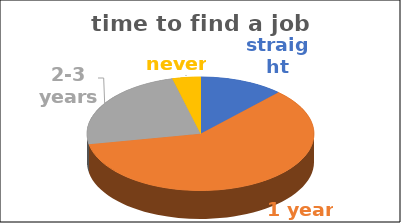
| Category | time to find a job | Series 1 | Series 2 | Series 3 | Series 4 |
|---|---|---|---|---|---|
| straight away | 0.12 |  |  |  |  |
| 1 year | 0.6 |  |  |  |  |
| 2-3 years | 0.24 |  |  |  |  |
| never | 0.04 |  |  |  |  |